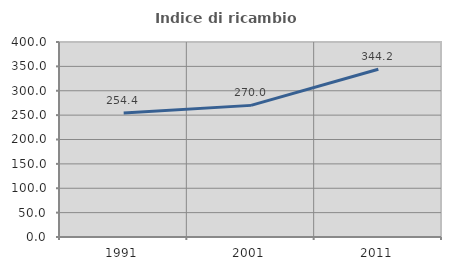
| Category | Indice di ricambio occupazionale  |
|---|---|
| 1991.0 | 254.362 |
| 2001.0 | 270 |
| 2011.0 | 344.172 |